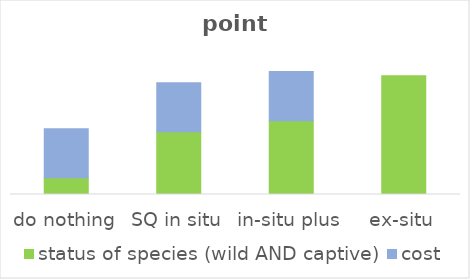
| Category | status of species (wild AND captive) | cost |
|---|---|---|
| do nothing | 0.079 | 0.231 |
| SQ in situ | 0.294 | 0.231 |
| in-situ plus | 0.347 | 0.231 |
| ex-situ | 0.558 | 0 |